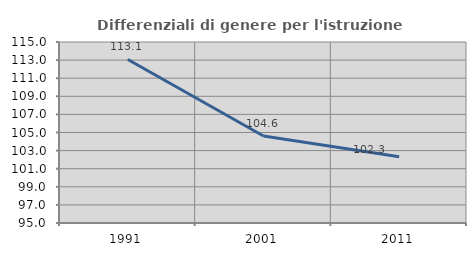
| Category | Differenziali di genere per l'istruzione superiore |
|---|---|
| 1991.0 | 113.067 |
| 2001.0 | 104.617 |
| 2011.0 | 102.32 |